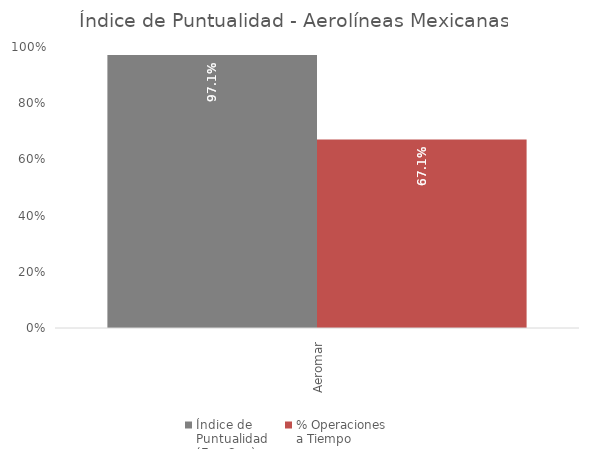
| Category | Índice de 
Puntualidad
(Ene-Sep) | % Operaciones 
a Tiempo |
|---|---|---|
| Aeromar | 0.971 | 0.671 |